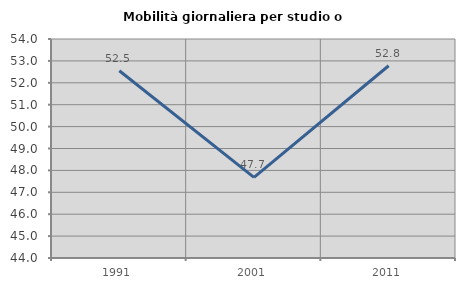
| Category | Mobilità giornaliera per studio o lavoro |
|---|---|
| 1991.0 | 52.55 |
| 2001.0 | 47.682 |
| 2011.0 | 52.778 |